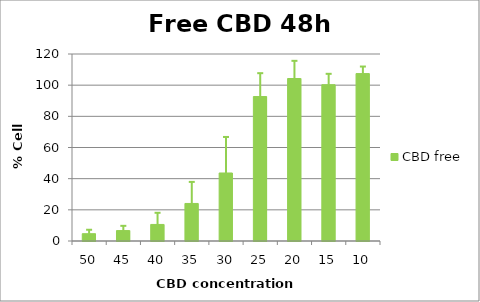
| Category | CBD free |
|---|---|
| 50.0 | 4.691 |
| 45.0 | 6.692 |
| 40.0 | 10.625 |
| 35.0 | 24.085 |
| 30.0 | 43.639 |
| 25.0 | 92.702 |
| 20.0 | 104.271 |
| 15.0 | 100.289 |
| 10.0 | 107.436 |